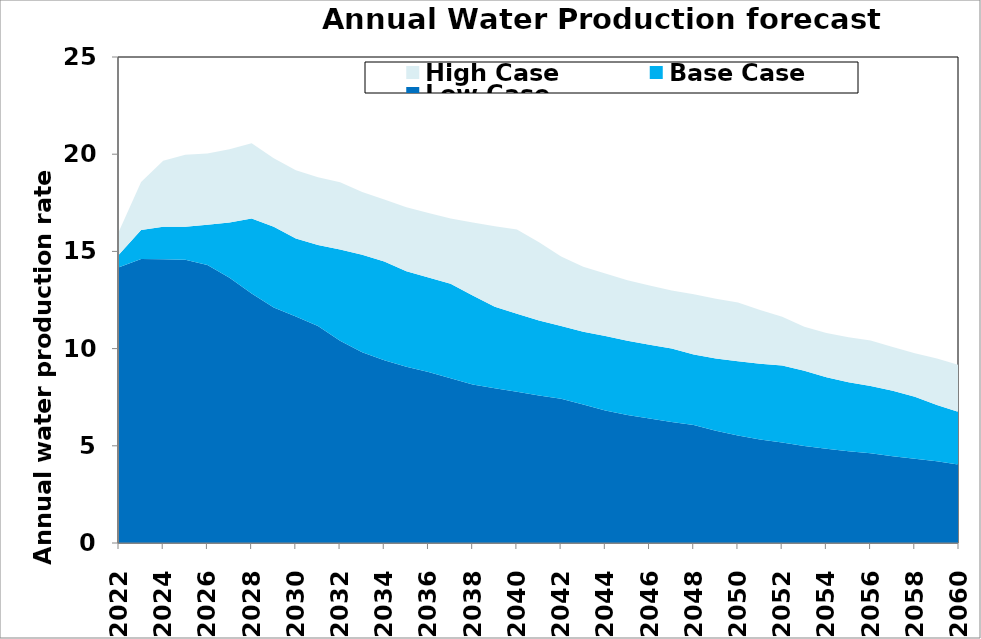
| Category | Low Case | Base Case | High Case |
|---|---|---|---|
| 2022.0 | 14178911.996 | 666530.366 | 1189207.781 |
| 2023.0 | 14611729.103 | 1484565.515 | 2469468.119 |
| 2024.0 | 14599354.538 | 1665050.899 | 3396516.937 |
| 2025.0 | 14567469.128 | 1703355.102 | 3703714.807 |
| 2026.0 | 14304569.488 | 2066377.324 | 3666087.643 |
| 2027.0 | 13648101.962 | 2842657.45 | 3767586.618 |
| 2028.0 | 12833400.476 | 3864219.748 | 3867426.007 |
| 2029.0 | 12110966.662 | 4150877.244 | 3529356.996 |
| 2030.0 | 11653029.905 | 4016466.383 | 3509361.065 |
| 2031.0 | 11157908.466 | 4165417.719 | 3492456.011 |
| 2032.0 | 10408164.975 | 4686026.1 | 3467914.689 |
| 2033.0 | 9816454.179 | 5016871.373 | 3218556.22 |
| 2034.0 | 9402119.175 | 5082168.868 | 3189117.89 |
| 2035.0 | 9071214.166 | 4911899.333 | 3284682.03 |
| 2036.0 | 8796915.02 | 4864586.272 | 3312139.684 |
| 2037.0 | 8476004.045 | 4863597.34 | 3354972.524 |
| 2038.0 | 8158168.689 | 4571080.874 | 3757732.69 |
| 2039.0 | 7957673.787 | 4196799.009 | 4140488.036 |
| 2040.0 | 7784772.77 | 4004992.323 | 4335576.847 |
| 2041.0 | 7592399.813 | 3857639.824 | 4020129.896 |
| 2042.0 | 7413979.684 | 3747503.617 | 3581571.574 |
| 2043.0 | 7120467.125 | 3750104.241 | 3343421.433 |
| 2044.0 | 6820216.98 | 3827066.187 | 3215501.302 |
| 2045.0 | 6582844.496 | 3814757.783 | 3114246.287 |
| 2046.0 | 6398740.155 | 3800874.788 | 3046425.136 |
| 2047.0 | 6228911.498 | 3773754.506 | 2987879.603 |
| 2048.0 | 6067609.156 | 3632920.829 | 3096817.691 |
| 2049.0 | 5771918.127 | 3723958.953 | 3073379.705 |
| 2050.0 | 5531541.806 | 3817713.279 | 3018336.868 |
| 2051.0 | 5329940.415 | 3887815.541 | 2770214.519 |
| 2052.0 | 5172373.959 | 3963775.892 | 2508492.525 |
| 2053.0 | 4995680.465 | 3864740.736 | 2268400.336 |
| 2054.0 | 4851700.168 | 3677426.394 | 2279473.356 |
| 2055.0 | 4721352.185 | 3547893.161 | 2311157.026 |
| 2056.0 | 4612508.036 | 3459746.312 | 2345223.484 |
| 2057.0 | 4462427.647 | 3368238.456 | 2254177.813 |
| 2058.0 | 4328008.342 | 3195946.361 | 2237723.689 |
| 2059.0 | 4211218.789 | 2891155.083 | 2387720.154 |
| 2060.0 | 4026345.358 | 2709799.575 | 2418567.776 |